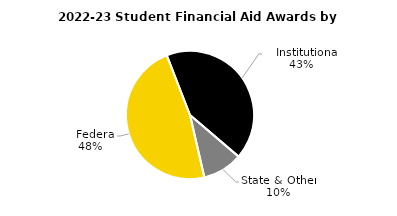
| Category | Series 0 |
|---|---|
|    Federal | 253075903 |
|    Institutional | 223773794 |
| State & Other | 53700158 |